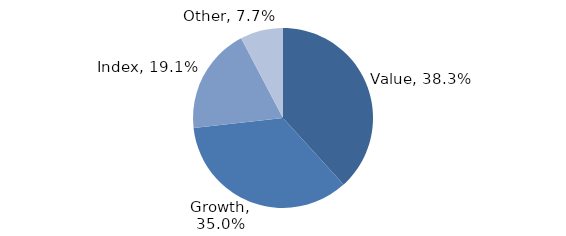
| Category | Investment Style |
|---|---|
| Value | 0.383 |
| Growth | 0.35 |
| Index | 0.191 |
| Other | 0.077 |